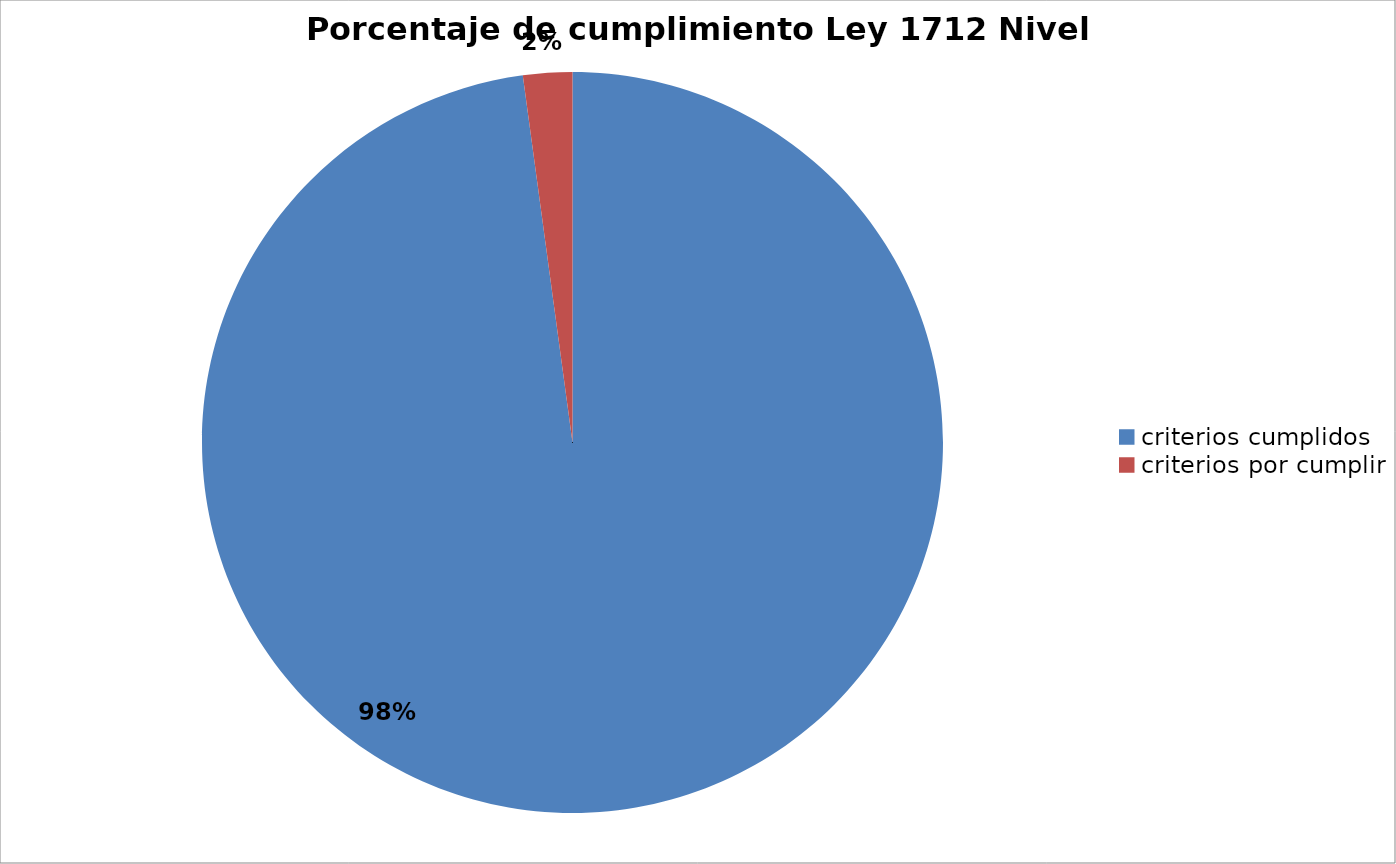
| Category | Series 0 |
|---|---|
| criterios cumplidos | 137 |
| criterios por cumplir | 3 |